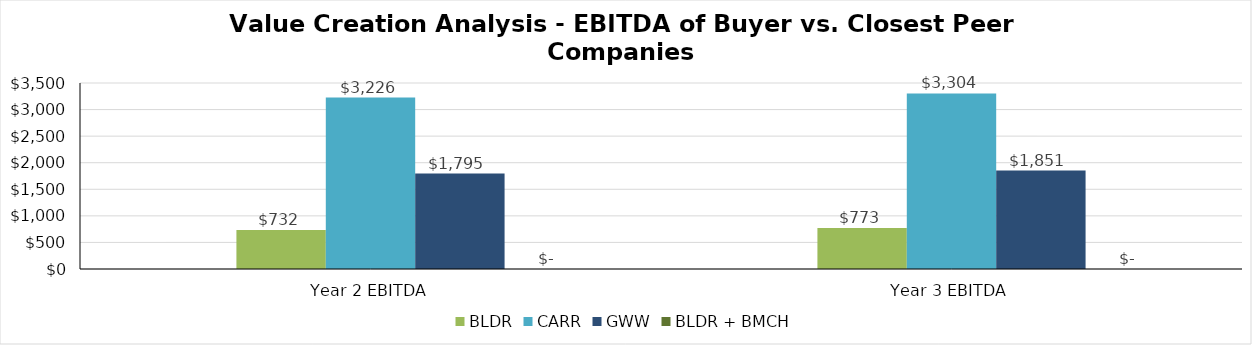
| Category | Series 0 | BLDR | CARR | GWW | BLDR + BMCH |
|---|---|---|---|---|---|
| Year 2 EBITDA |  | 732.379 | 3225.69 | 1795.27 | 0 |
| Year 3 EBITDA |  | 773.483 | 3304.44 | 1851.49 | 0 |